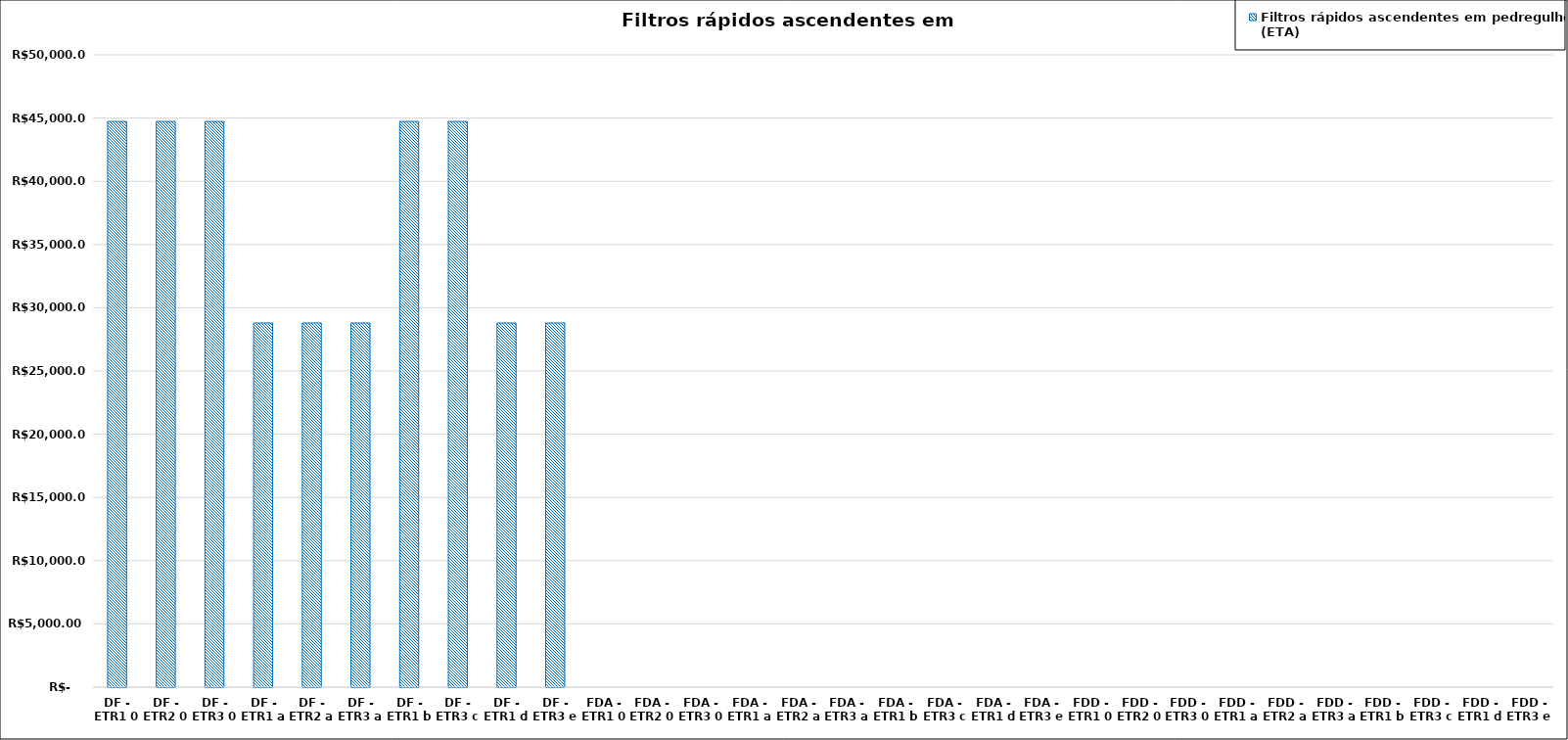
| Category | Filtros rápidos ascendentes em pedregulho (ETA) |
|---|---|
| DF - ETR1 0 | 44729.342 |
| DF - ETR2 0 | 44729.342 |
| DF - ETR3 0 | 44729.342 |
| DF - ETR1 a | 28794.822 |
| DF - ETR2 a | 28794.822 |
| DF - ETR3 a | 28794.822 |
| DF - ETR1 b | 44729.342 |
| DF - ETR3 c | 44729.342 |
| DF - ETR1 d | 28794.822 |
| DF - ETR3 e | 28794.822 |
| FDA - ETR1 0 | 0 |
| FDA - ETR2 0 | 0 |
| FDA - ETR3 0 | 0 |
| FDA - ETR1 a | 0 |
| FDA - ETR2 a | 0 |
| FDA - ETR3 a | 0 |
| FDA - ETR1 b | 0 |
| FDA - ETR3 c | 0 |
| FDA - ETR1 d | 0 |
| FDA - ETR3 e | 0 |
| FDD - ETR1 0 | 0 |
| FDD - ETR2 0 | 0 |
| FDD - ETR3 0 | 0 |
| FDD - ETR1 a | 0 |
| FDD - ETR2 a | 0 |
| FDD - ETR3 a | 0 |
| FDD - ETR1 b | 0 |
| FDD - ETR3 c | 0 |
| FDD - ETR1 d | 0 |
| FDD - ETR3 e | 0 |